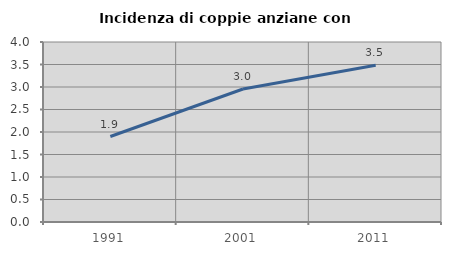
| Category | Incidenza di coppie anziane con figli |
|---|---|
| 1991.0 | 1.9 |
| 2001.0 | 2.956 |
| 2011.0 | 3.481 |